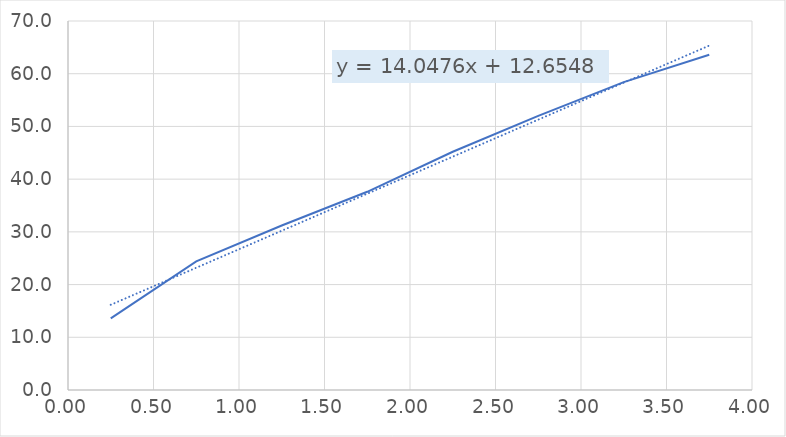
| Category | Series 0 |
|---|---|
| 0.25 | 13.6 |
| 0.75 | 24.4 |
| 1.25 | 31.2 |
| 1.75 | 37.6 |
| 2.25 | 45.2 |
| 2.75 | 52 |
| 3.25 | 58.4 |
| 3.75 | 63.6 |